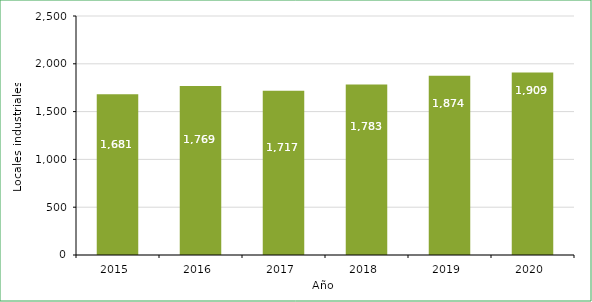
| Category | Series 0 |
|---|---|
| 2015.0 | 1681 |
| 2016.0 | 1769 |
| 2017.0 | 1717 |
| 2018.0 | 1783 |
| 2019.0 | 1874 |
| 2020.0 | 1909 |